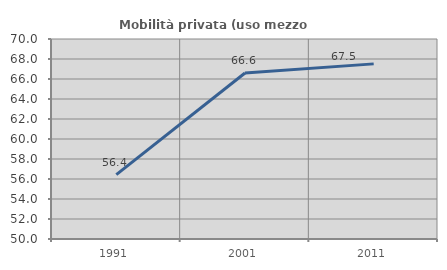
| Category | Mobilità privata (uso mezzo privato) |
|---|---|
| 1991.0 | 56.443 |
| 2001.0 | 66.597 |
| 2011.0 | 67.513 |